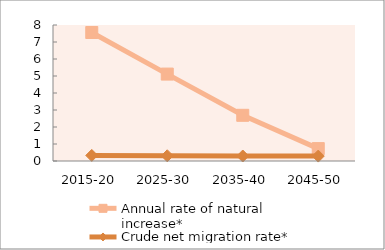
| Category | Annual rate of natural increase* | Crude net migration rate* |
|---|---|---|
| 2015-20 | 7.558 | 0.328 |
| 2025-30 | 5.113 | 0.307 |
| 2035-40 | 2.688 | 0.294 |
| 2045-50 | 0.729 | 0.289 |